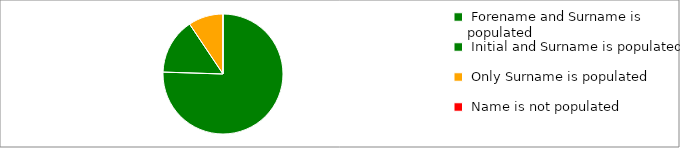
| Category | Series 0 |
|---|---|
|  Forename and Surname is populated  | 57629 |
|  Initial and Surname is populated  | 11519 |
|  Only Surname is populated  | 7171 |
|  Name is not populated  | 1 |